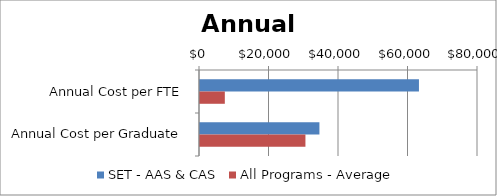
| Category | SET - AAS & CAS | All Programs - Average |
|---|---|---|
| Annual Cost per FTE | 63007.167 | 7144 |
| Annual Cost per Graduate | 34367.545 | 30340 |